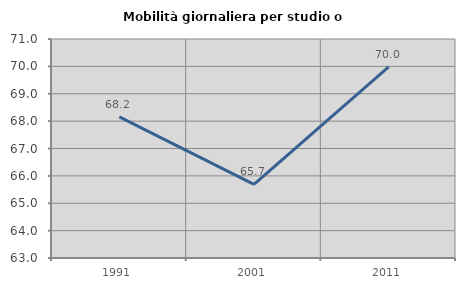
| Category | Mobilità giornaliera per studio o lavoro |
|---|---|
| 1991.0 | 68.155 |
| 2001.0 | 65.691 |
| 2011.0 | 69.981 |